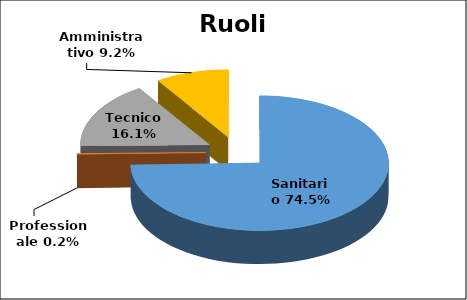
| Category | Series 0 |
|---|---|
| Sanitario | 0.745 |
| Professionale | 0.002 |
| Tecnico | 0.161 |
| Amministrativo | 0.092 |